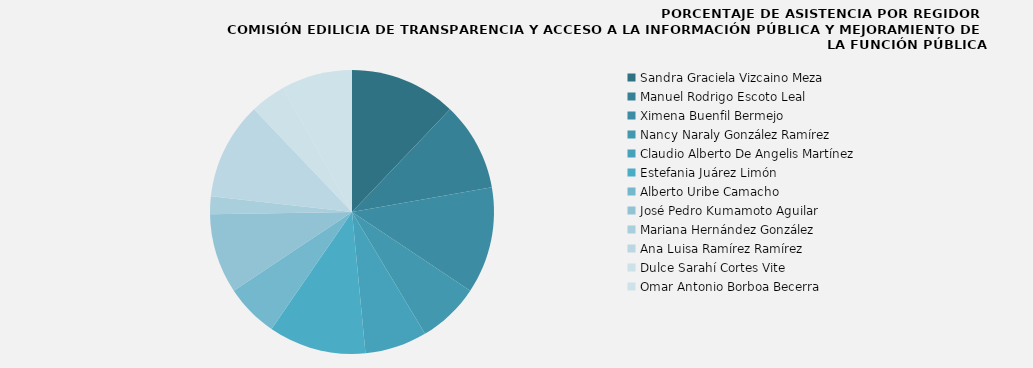
| Category | Sandra Graciela Vizcaino Meza |
|---|---|
| Sandra Graciela Vizcaino Meza | 100 |
| Manuel Rodrigo Escoto Leal | 83.333 |
| Ximena Buenfil Bermejo | 100 |
| Nancy Naraly González Ramírez | 58.333 |
| Claudio Alberto De Angelis Martínez | 58.333 |
| Estefania Juárez Limón | 91.667 |
| Alberto Uribe Camacho | 50 |
| José Pedro Kumamoto Aguilar | 75 |
| Mariana Hernández González | 16.667 |
| Ana Luisa Ramírez Ramírez | 91.667 |
| Dulce Sarahí Cortes Vite | 33.333 |
| Omar Antonio Borboa Becerra | 66.667 |